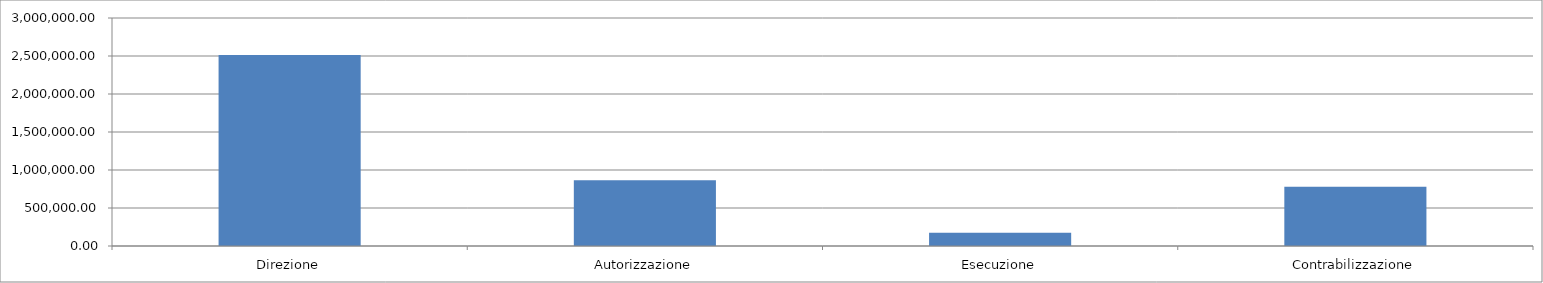
| Category | Series 0 |
|---|---|
| Direzione | 2513647.703 |
| Autorizzazione | 866775.07 |
| Esecuzione | 173355.014 |
| Contrabilizzazione | 780097.563 |